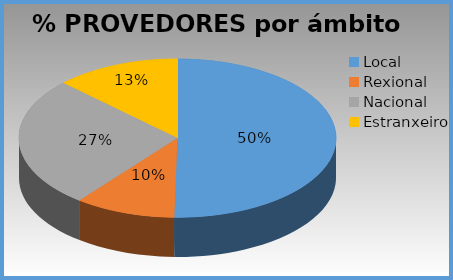
| Category | % provedores |
|---|---|
| Local | 0.503 |
| Rexional | 0.103 |
| Nacional | 0.266 |
| Estranxeiro | 0.128 |